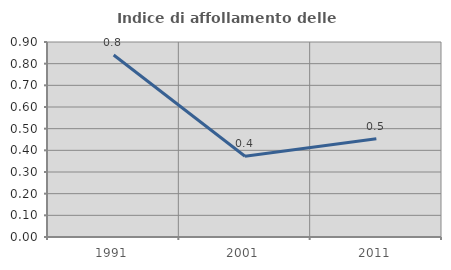
| Category | Indice di affollamento delle abitazioni  |
|---|---|
| 1991.0 | 0.84 |
| 2001.0 | 0.373 |
| 2011.0 | 0.453 |